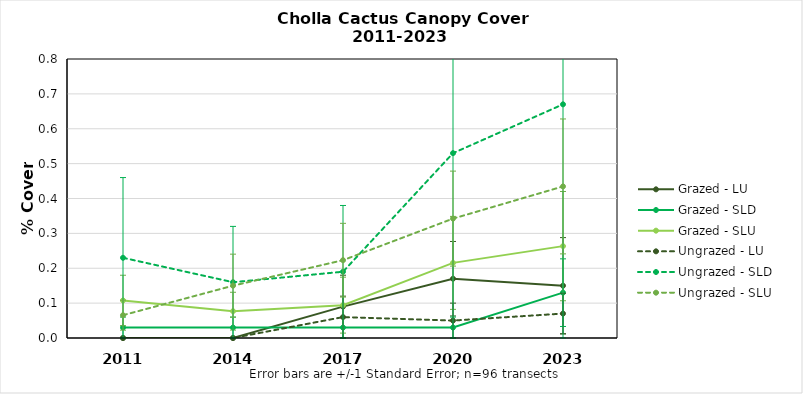
| Category | Grazed - LU | Grazed - SLD | Grazed - SLU | Ungrazed - LU | Ungrazed - SLD | Ungrazed - SLU |
|---|---|---|---|---|---|---|
| 2011.0 | 0 | 0.03 | 0.108 | 0 | 0.23 | 0.065 |
| 2014.0 | 0 | 0.03 | 0.077 | 0 | 0.16 | 0.15 |
| 2017.0 | 0.09 | 0.03 | 0.094 | 0.06 | 0.19 | 0.223 |
| 2020.0 | 0.17 | 0.03 | 0.215 | 0.05 | 0.53 | 0.342 |
| 2023.0 | 0.15 | 0.13 | 0.263 | 0.07 | 0.67 | 0.435 |